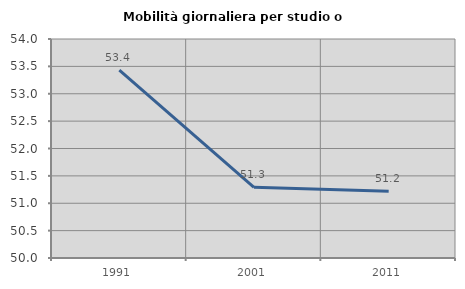
| Category | Mobilità giornaliera per studio o lavoro |
|---|---|
| 1991.0 | 53.43 |
| 2001.0 | 51.292 |
| 2011.0 | 51.22 |